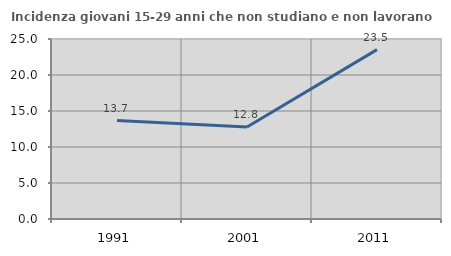
| Category | Incidenza giovani 15-29 anni che non studiano e non lavorano  |
|---|---|
| 1991.0 | 13.678 |
| 2001.0 | 12.766 |
| 2011.0 | 23.529 |